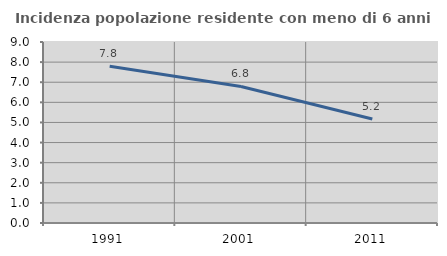
| Category | Incidenza popolazione residente con meno di 6 anni |
|---|---|
| 1991.0 | 7.789 |
| 2001.0 | 6.788 |
| 2011.0 | 5.167 |